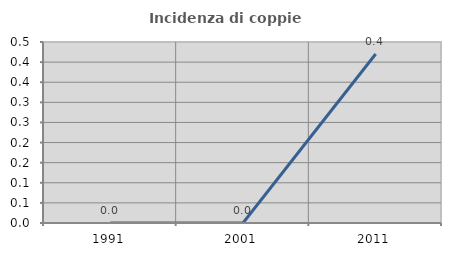
| Category | Incidenza di coppie miste |
|---|---|
| 1991.0 | 0 |
| 2001.0 | 0 |
| 2011.0 | 0.42 |